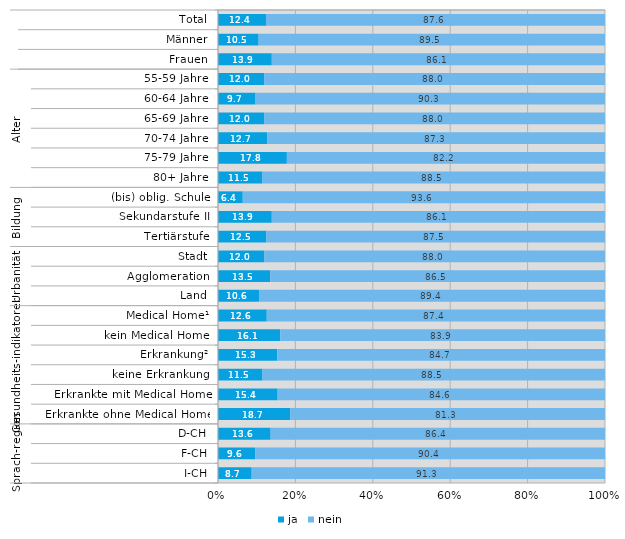
| Category | ja | nein |
|---|---|---|
| 0 | 12.4 | 87.6 |
| 1 | 10.5 | 89.5 |
| 2 | 13.9 | 86.1 |
| 3 | 12 | 88 |
| 4 | 9.7 | 90.3 |
| 5 | 12 | 88 |
| 6 | 12.7 | 87.3 |
| 7 | 17.8 | 82.2 |
| 8 | 11.5 | 88.5 |
| 9 | 6.4 | 93.6 |
| 10 | 13.9 | 86.1 |
| 11 | 12.5 | 87.5 |
| 12 | 12 | 88 |
| 13 | 13.5 | 86.5 |
| 14 | 10.6 | 89.4 |
| 15 | 12.6 | 87.4 |
| 16 | 16.1 | 83.9 |
| 17 | 15.3 | 84.7 |
| 18 | 11.5 | 88.5 |
| 19 | 15.4 | 84.6 |
| 20 | 18.7 | 81.3 |
| 21 | 13.6 | 86.4 |
| 22 | 9.6 | 90.4 |
| 23 | 8.7 | 91.3 |